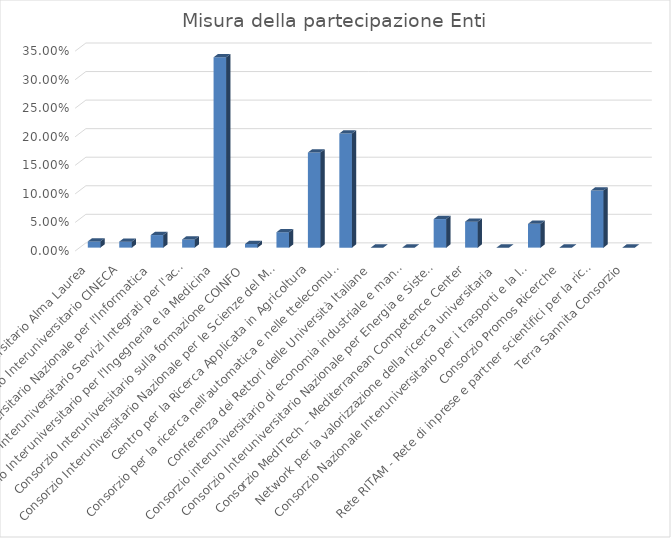
| Category | Misura della partecipazione |
|---|---|
| Consorzio Interuniversitario Alma Laurea | 0.011 |
| Consorzio Interuniversitario CINECA | 0.01 |
| Consorzio Interuniversitario Nazionale per l'Informatica | 0.022 |
| CISIA Consorzio Interuniversitario Servizi Integrati per l'accesso | 0.014 |
| Consorzio Interuniversitario per l'Ingegneria e la Medicina | 0.333 |
| Consorzio Interuniversitario sulla formazione COINFO | 0.006 |
| Consorzio Interuniversitario Nazionale per le Scienze del Mare CONISMA | 0.027 |
| Centro per la Ricerca Applicata in Agricoltura | 0.167 |
| Consorzio per la ricerca nell'automatica e nelle ttelecomunicazioni CRAT | 0.2 |
| Conferenza dei Rettori delle Università Italiane | 0 |
| Consorzio interuniversitario di economia industriale e manageriale CUEIM | 0 |
| Consorzio Interuniversitario Nazionale per Energia e Sistemi Elettrici | 0.05 |
| Consorzio MedITech – Mediterranean Competence Center | 0.046 |
| Network per la valorizzazione della ricerca universitaria | 0 |
| Consorzio Nazionale Interuniversitario per i trasporti e la logistica | 0.042 |
| Consorzio Promos Ricerche | 0 |
| Rete RITAM - Rete di inprese e partner scientifici per la ricerca e applicazione di tecnologie avanzate | 0.1 |
| Terra Sannita Consorzio | 0 |